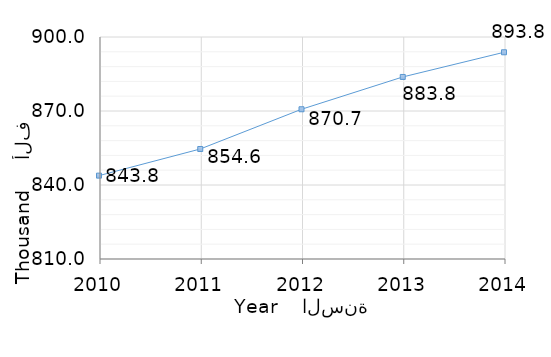
| Category | القيمة
Value |
|---|---|
| 2014.0 | 893.8 |
| 2013.0 | 883.8 |
| 2012.0 | 870.7 |
| 2011.0 | 854.6 |
| 2010.0 | 843.8 |